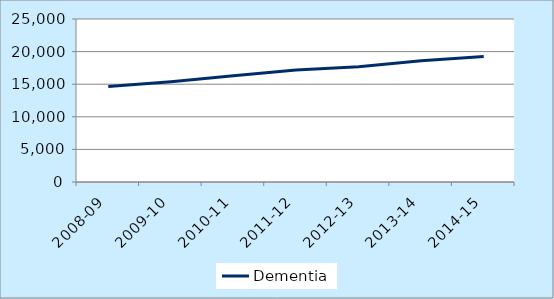
| Category | Dementia |
|---|---|
| 2008-09 | 14636 |
| 2009-10 | 15389 |
| 2010-11 | 16297 |
| 2011-12 | 17184 |
| 2012-13 | 17661 |
| 2013-14 | 18591 |
| 2014-15 | 19239 |